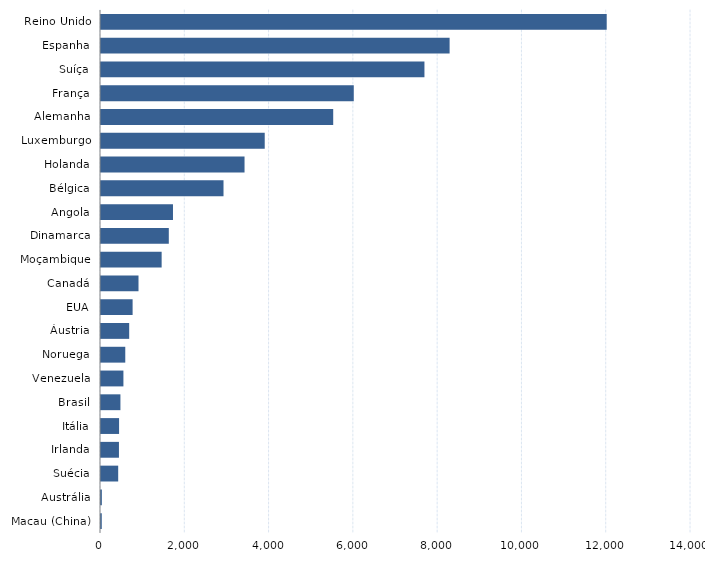
| Category | Series 0 |
|---|---|
| Macau (China) | 18 |
| Austrália | 20 |
| Suécia | 408 |
| Irlanda | 426 |
| Itália | 429 |
| Brasil | 461 |
| Venezuela | 532 |
| Noruega | 576 |
| Áustria | 669 |
| EUA | 750 |
| Canadá | 890 |
| Moçambique | 1439 |
| Dinamarca | 1609 |
| Angola | 1708 |
| Bélgica | 2907 |
| Holanda | 3406 |
| Luxemburgo | 3885 |
| Alemanha | 5510 |
| França | 5998 |
| Suíça | 7675 |
| Espanha | 8272 |
| Reino Unido | 12000 |